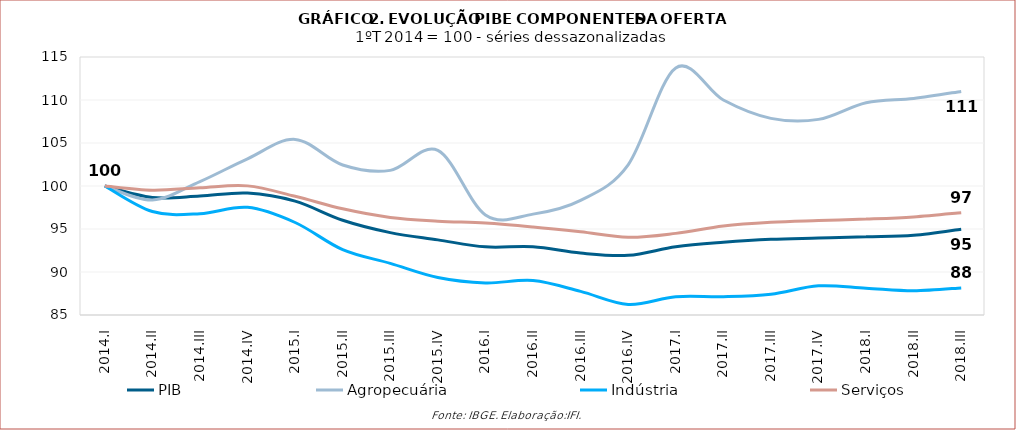
| Category | PIB | Agropecuária | Indústria | Serviços |
|---|---|---|---|---|
| 2014.I | 100 | 100 | 100 | 100 |
| 2014.II | 98.655 | 98.38 | 97.028 | 99.512 |
| 2014.III | 98.829 | 100.517 | 96.775 | 99.8 |
| 2014.IV | 99.177 | 103.163 | 97.519 | 100.015 |
| 2015.I | 98.236 | 105.418 | 95.755 | 98.805 |
| 2015.II | 96.012 | 102.437 | 92.597 | 97.346 |
| 2015.III | 94.58 | 101.815 | 91.001 | 96.341 |
| 2015.IV | 93.737 | 104.135 | 89.355 | 95.915 |
| 2016.I | 92.926 | 96.634 | 88.728 | 95.693 |
| 2016.II | 92.93 | 96.728 | 89.003 | 95.239 |
| 2016.III | 92.196 | 98.328 | 87.744 | 94.671 |
| 2016.IV | 91.935 | 102.465 | 86.232 | 94.034 |
| 2017.I | 92.935 | 113.731 | 87.122 | 94.492 |
| 2017.II | 93.457 | 109.996 | 87.129 | 95.352 |
| 2017.III | 93.804 | 107.866 | 87.418 | 95.776 |
| 2017.IV | 93.948 | 107.747 | 88.393 | 95.979 |
| 2018.I | 94.097 | 109.689 | 88.118 | 96.149 |
| 2018.II | 94.267 | 110.185 | 87.816 | 96.399 |
| 2018.III | 94.983 | 111 | 88.151 | 96.894 |